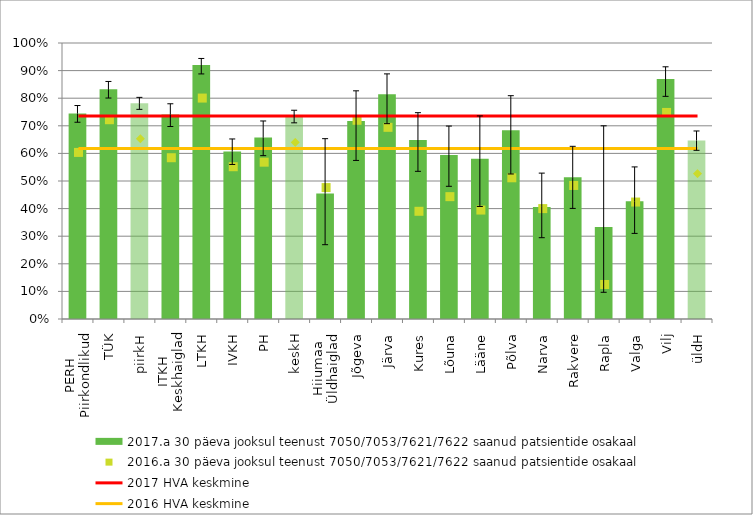
| Category | 2017.a 30 päeva jooksul teenust 7050/7053/7621/7622 saanud patsientide osakaal |
|---|---|
| 0 | 0.744 |
| 1 | 0.833 |
| 2 | 0.782 |
| 3 | 0.741 |
| 4 | 0.92 |
| 5 | 0.607 |
| 6 | 0.657 |
| 7 | 0.734 |
| 8 | 0.455 |
| 9 | 0.717 |
| 10 | 0.814 |
| 11 | 0.649 |
| 12 | 0.595 |
| 13 | 0.581 |
| 14 | 0.684 |
| 15 | 0.406 |
| 16 | 0.514 |
| 17 | 0.333 |
| 18 | 0.426 |
| 19 | 0.869 |
| 20 | 0.647 |